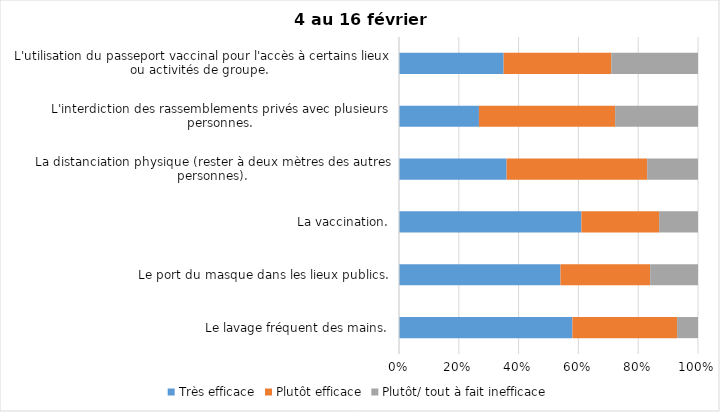
| Category | Très efficace | Plutôt efficace | Plutôt/ tout à fait inefficace |
|---|---|---|---|
| Le lavage fréquent des mains. | 58 | 35 | 7 |
| Le port du masque dans les lieux publics. | 54 | 30 | 16 |
| La vaccination. | 61 | 26 | 13 |
| La distanciation physique (rester à deux mètres des autres personnes). | 36 | 47 | 17 |
| L'interdiction des rassemblements privés avec plusieurs personnes. | 27 | 46 | 28 |
| L'utilisation du passeport vaccinal pour l'accès à certains lieux ou activités de groupe.  | 35 | 36 | 29 |